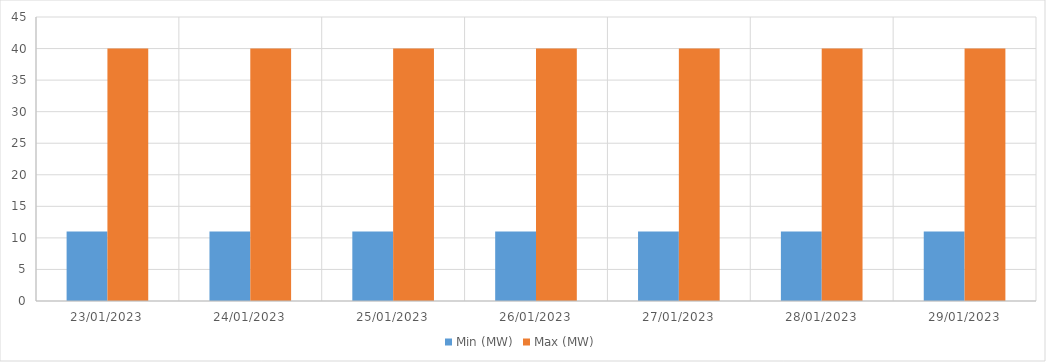
| Category | Min (MW) | Max (MW) |
|---|---|---|
| 23/01/2023 | 11 | 40 |
| 24/01/2023 | 11 | 40 |
| 25/01/2023 | 11 | 40 |
| 26/01/2023 | 11 | 40 |
| 27/01/2023 | 11 | 40 |
| 28/01/2023 | 11 | 40 |
| 29/01/2023 | 11 | 40 |